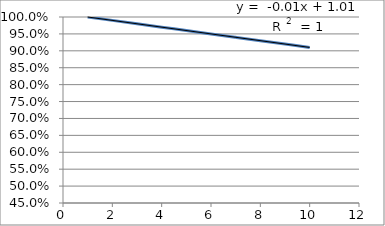
| Category | Series 0 |
|---|---|
| 1.0 | 1 |
| 2.0 | 0.99 |
| 3.0 | 0.98 |
| 4.0 | 0.97 |
| 5.0 | 0.96 |
| 6.0 | 0.95 |
| 7.0 | 0.94 |
| 8.0 | 0.93 |
| 9.0 | 0.92 |
| 10.0 | 0.91 |